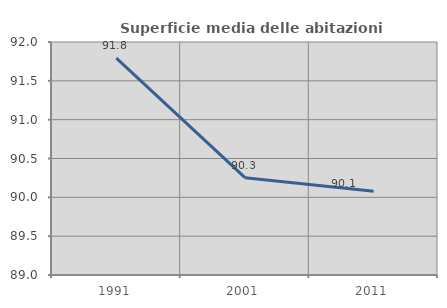
| Category | Superficie media delle abitazioni occupate |
|---|---|
| 1991.0 | 91.792 |
| 2001.0 | 90.253 |
| 2011.0 | 90.08 |